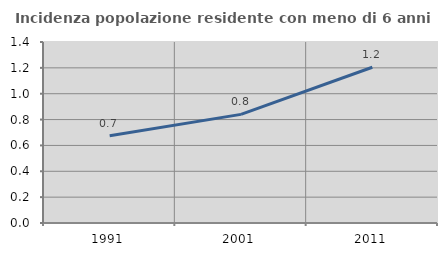
| Category | Incidenza popolazione residente con meno di 6 anni |
|---|---|
| 1991.0 | 0.676 |
| 2001.0 | 0.84 |
| 2011.0 | 1.205 |